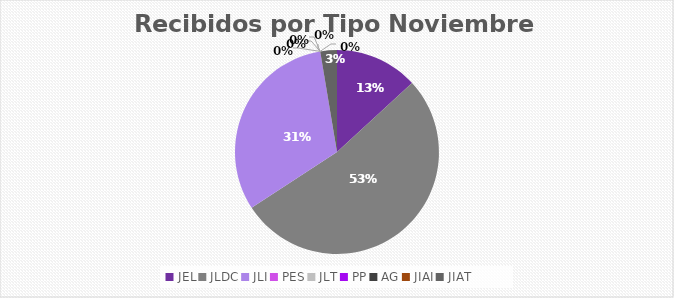
| Category | Series 0 |
|---|---|
| JEL | 5 |
| JLDC | 20 |
| JLI | 12 |
| PES | 0 |
| JLT | 0 |
| PP | 0 |
| AG | 0 |
| JIAI | 0 |
| JIAT | 1 |